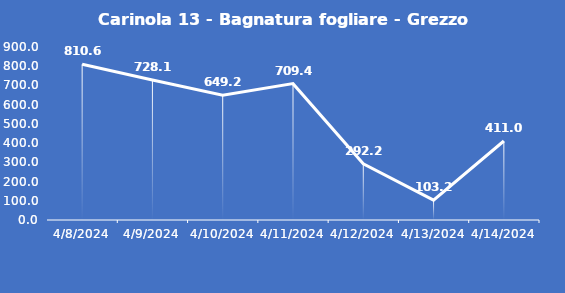
| Category | Carinola 13 - Bagnatura fogliare - Grezzo (min) |
|---|---|
| 4/8/24 | 810.6 |
| 4/9/24 | 728.1 |
| 4/10/24 | 649.2 |
| 4/11/24 | 709.4 |
| 4/12/24 | 292.2 |
| 4/13/24 | 103.2 |
| 4/14/24 | 411 |